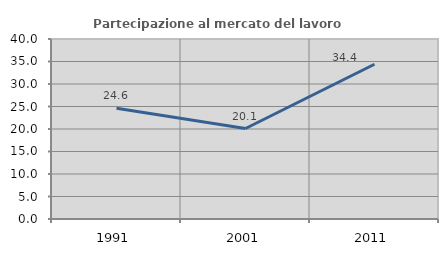
| Category | Partecipazione al mercato del lavoro  femminile |
|---|---|
| 1991.0 | 24.623 |
| 2001.0 | 20.109 |
| 2011.0 | 34.395 |